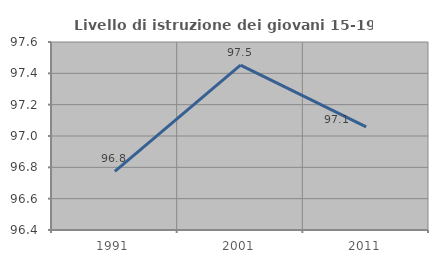
| Category | Livello di istruzione dei giovani 15-19 anni |
|---|---|
| 1991.0 | 96.774 |
| 2001.0 | 97.452 |
| 2011.0 | 97.059 |